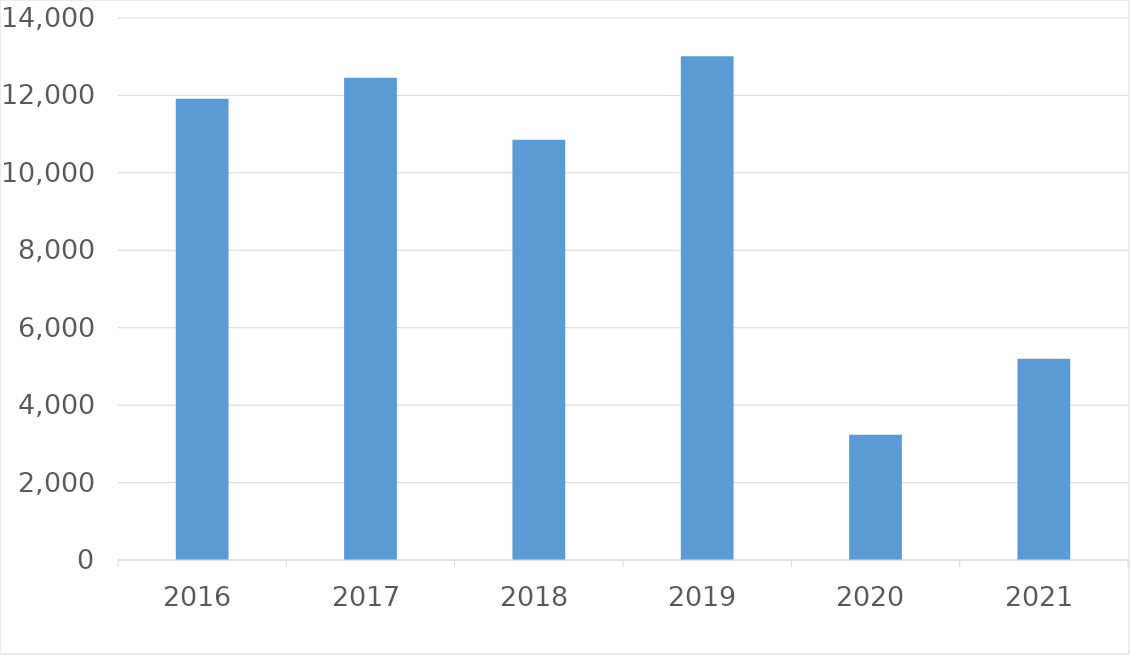
| Category | Series 0 |
|---|---|
| 2016 | 11913 |
| 2017 | 12454 |
| 2018 | 10856 |
| 2019 | 13014 |
| 2020 | 3234 |
| 2021 | 5199 |